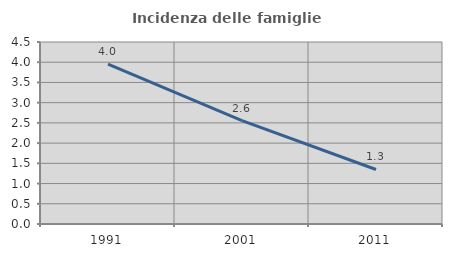
| Category | Incidenza delle famiglie numerose |
|---|---|
| 1991.0 | 3.956 |
| 2001.0 | 2.555 |
| 2011.0 | 1.348 |